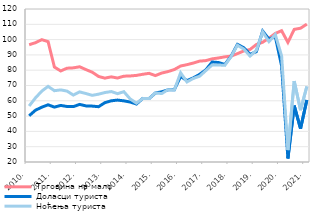
| Category | Трговина на мало | Доласци туриста | Ноћења туриста  |
|---|---|---|---|
| 2010. | 96.647 | 50.221 | 56.611 |
| II | 97.979 | 53.848 | 61.89 |
| III | 99.953 | 55.818 | 66.339 |
| IV | 98.675 | 57.383 | 69.417 |
| 2011. | 82.065 | 55.872 | 66.617 |
| II | 79.506 | 56.975 | 67.135 |
| III | 81.313 | 56.277 | 66.349 |
| IV | 81.537 | 56.193 | 63.741 |
| 2012. | 82.245 | 57.646 | 65.806 |
| II | 80.392 | 56.675 | 64.748 |
| III | 78.676 | 56.525 | 63.57 |
| IV | 75.906 | 56.144 | 64.34 |
| 2013. | 74.806 | 58.784 | 65.396 |
| II | 75.658 | 59.991 | 66.041 |
| III | 74.888 | 60.471 | 64.66 |
| IV | 76.086 | 59.97 | 65.949 |
| 2014. | 76.235 | 59.201 | 61.238 |
| II | 76.606 | 57.898 | 58.474 |
| III | 77.333 | 61.576 | 61.458 |
| IV | 77.952 | 61.443 | 61.428 |
| 2015. | 76.479 | 65.077 | 65.151 |
| II | 78.141 | 65.893 | 64.725 |
| III | 79.101 | 67.139 | 67.274 |
| IV | 80.433 | 67.243 | 67.051 |
| 2016. | 82.735 | 75.916 | 78.308 |
| II | 83.614 | 73.201 | 72.309 |
| III | 84.661 | 74.958 | 74.616 |
| IV | 85.932 | 77.245 | 76.031 |
| 2017. | 86.267 | 80.25 | 79.78 |
| II | 87.417 | 85.36 | 83.456 |
| III | 88.005 | 85.023 | 83.416 |
| IV | 88.727 | 83.751 | 83.168 |
| 2018. | 89.203 | 89.159 | 88.948 |
| II | 90.829 | 96.861 | 96.327 |
| III | 92.551 | 94.737 | 93.85 |
| IV | 93.546 | 90.399 | 89.25 |
| 2019. | 96.779 | 92.12 | 93.016 |
| II | 98.287 | 105.561 | 105.001 |
| III | 100.909 | 100.321 | 98.707 |
| IV | 104.024 | 101.999 | 103.276 |
| 2020. | 105.828 | 82.825 | 89.36 |
| II | 98.178 | 22.312 | 27.824 |
| III | 106.681 | 56.857 | 72.892 |
| IV | 107.442 | 41.802 | 53.87 |
| 2021. | 110.102 | 60.521 | 69.38 |